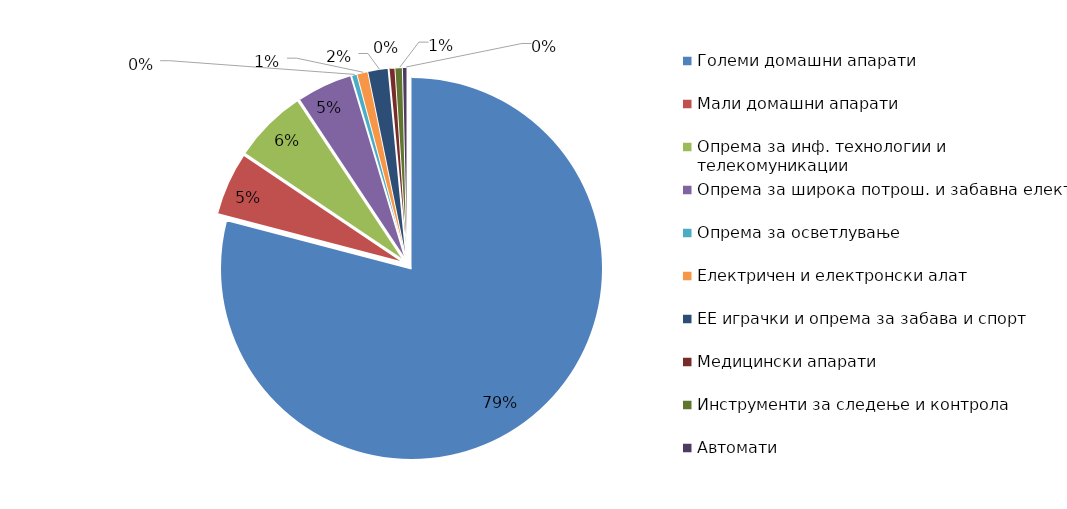
| Category | Series 0 |
|---|---|
| Големи домашни апарати | 12368691.44 |
| Мали домашни апарати | 837138.29 |
| Опрема за инф. технологии и телекомуникации | 977748.6 |
| Опрема за широка потрош. и забавна електр. | 737263.77 |
| Опрема за осветлување | 72116.91 |
| Електричен и електронски алат | 145473.87 |
| ЕЕ играчки и опрема за забава и спорт | 268745.79 |
| Медицински апарати | 76330.24 |
| Инструменти за следење и контрола | 97789.5 |
| Автомати | 60462.05 |